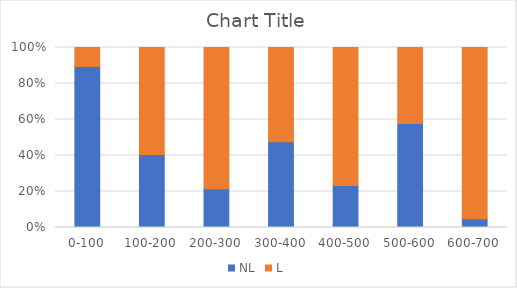
| Category | NL | L |
|---|---|---|
| 0-100 | 0.5 | 0.059 |
| 100-200 | 0.08 | 0.118 |
| 200-300 | 0.08 | 0.294 |
| 300-400 | 0.107 | 0.118 |
| 400-500 | 0.036 | 0.118 |
| 500-600 | 0.08 | 0.059 |
| 600-700 | 0.009 | 0.176 |